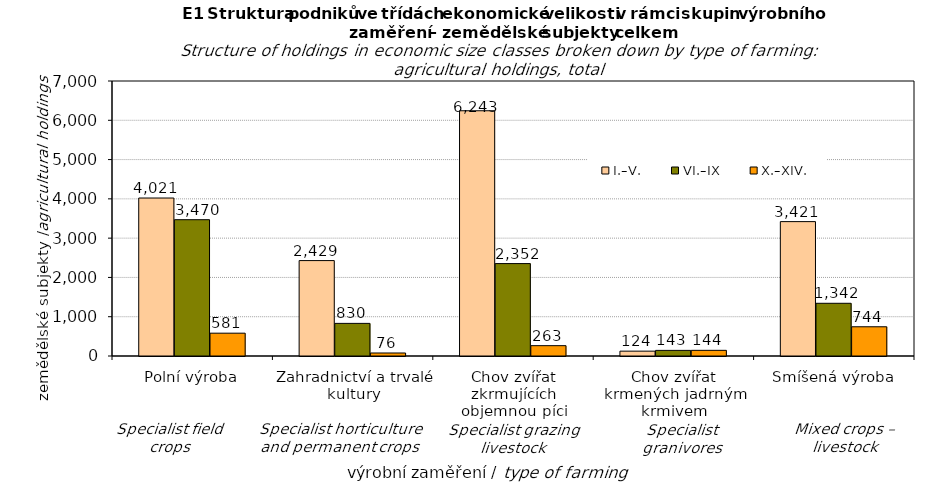
| Category | I.–V. | VI.–IX | X.–XIV. |
|---|---|---|---|
| Polní výroba | 4021.384 | 3469.553 | 581 |
| Zahradnictví a trvalé kultury | 2428.652 | 830.18 | 76.386 |
| Chov zvířat zkrmujících objemnou píci | 6242.694 | 2352.279 | 263 |
| Chov zvířat krmených jadrným krmivem | 123.529 | 143 | 144 |
| Smíšená výroba | 3420.84 | 1341.831 | 744 |